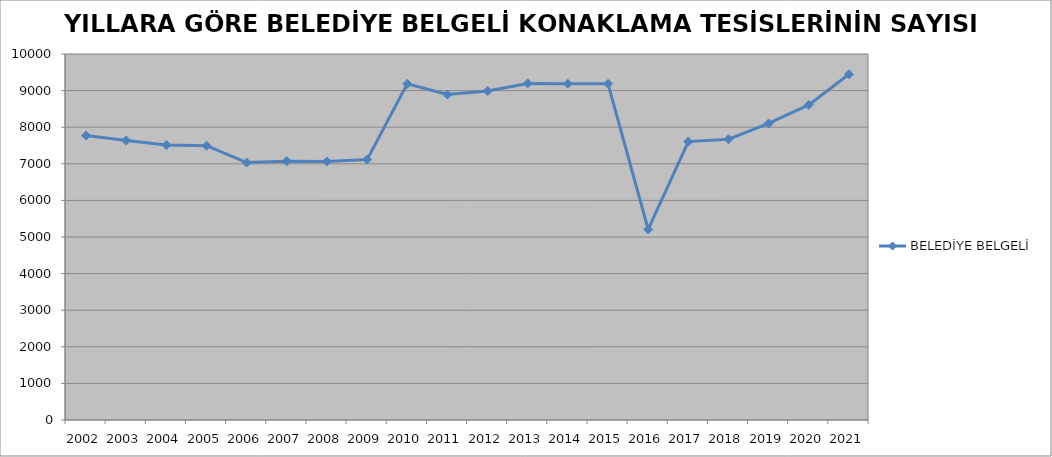
| Category | BELEDİYE BELGELİ |
|---|---|
| 2002 | 7772 |
| 2003 | 7637 |
| 2004 | 7514 |
| 2005 | 7494 |
| 2006 | 7033 |
| 2007 | 7073 |
| 2008 | 7064 |
| 2009 | 7115 |
| 2010 | 9185 |
| 2011 | 8893 |
| 2012 | 8988 |
| 2013 | 9196 |
| 2014 | 9188 |
| 2015 | 9187 |
| 2016 | 5206 |
| 2017 | 7607 |
| 2018 | 7671 |
| 2019 | 8104 |
| 2020 | 8609 |
| 2021 | 9445 |